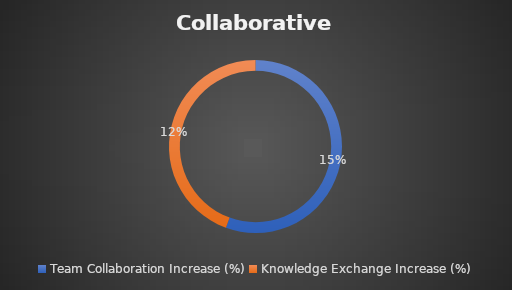
| Category | Typical Agile | Agile X |
|---|---|---|
| Team Collaboration Increase (%) | 0 | 0.15 |
| Knowledge Exchange Increase (%) | 0 | 0.12 |